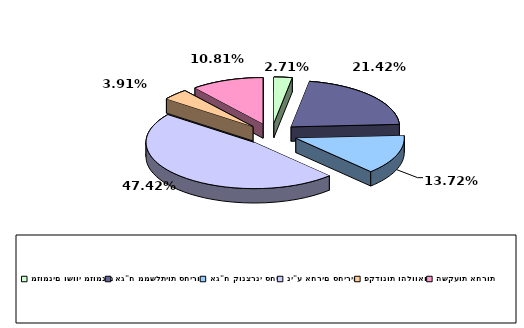
| Category | Series 0 |
|---|---|
| מזומנים ושווי מזומנים | 0.027 |
| אג"ח ממשלתיות סחירות | 0.214 |
| אג"ח קונצרני סחיר | 0.137 |
| ני"ע אחרים סחירים | 0.474 |
| פקדונות והלוואות | 0.039 |
| השקעות אחרות | 0.108 |